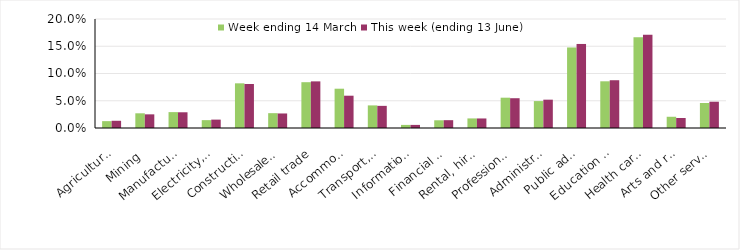
| Category | Week ending 14 March | This week (ending 13 June) |
|---|---|---|
| Agriculture, forestry and fishing | 0.013 | 0.013 |
| Mining | 0.027 | 0.025 |
| Manufacturing | 0.029 | 0.029 |
| Electricity, gas, water and waste services | 0.014 | 0.015 |
| Construction | 0.082 | 0.081 |
| Wholesale trade | 0.027 | 0.027 |
| Retail trade | 0.084 | 0.086 |
| Accommodation and food services | 0.072 | 0.059 |
| Transport, postal and warehousing | 0.041 | 0.041 |
| Information media and telecommunications | 0.006 | 0.006 |
| Financial and insurance services | 0.014 | 0.014 |
| Rental, hiring and real estate services | 0.018 | 0.017 |
| Professional, scientific and technical services | 0.056 | 0.055 |
| Administrative and support services | 0.049 | 0.052 |
| Public administration and safety | 0.148 | 0.154 |
| Education and training | 0.086 | 0.088 |
| Health care and social assistance | 0.167 | 0.171 |
| Arts and recreation services | 0.021 | 0.018 |
| Other services | 0.046 | 0.048 |